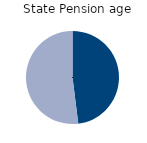
| Category | State Pension age |
|---|---|
| full-time | 48 |
| part-time | 52 |